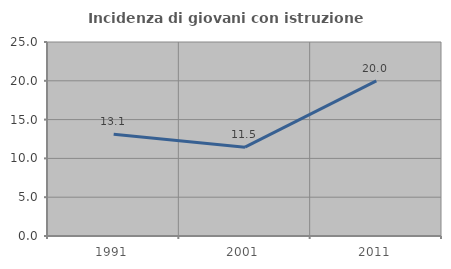
| Category | Incidenza di giovani con istruzione universitaria |
|---|---|
| 1991.0 | 13.103 |
| 2001.0 | 11.451 |
| 2011.0 | 20 |